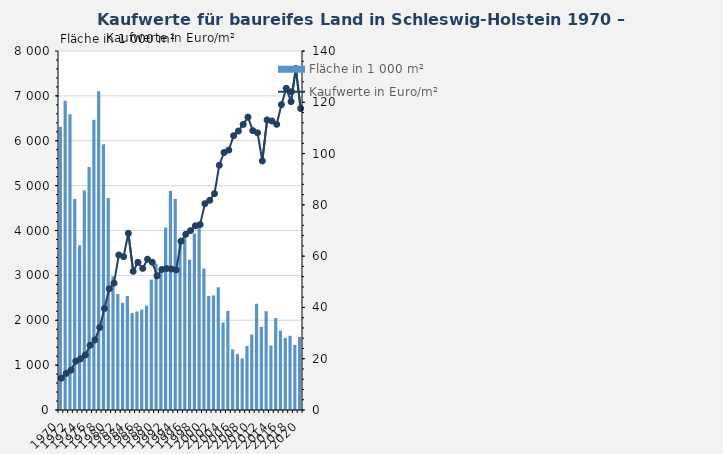
| Category | Fläche in 1 000 m² |
|---|---|
| 1970.0 | 6309.2 |
| 1971.0 | 6893 |
| 1972.0 | 6590.2 |
| 1973.0 | 4700.7 |
| 1974.0 | 3669.7 |
| 1975.0 | 4891.8 |
| 1976.0 | 5414.2 |
| 1977.0 | 6470.1 |
| 1978.0 | 7103.7 |
| 1979.0 | 5922.7 |
| 1980.0 | 4720.9 |
| 1981.0 | 2976.6 |
| 1982.0 | 2585.4 |
| 1983.0 | 2388.2 |
| 1984.0 | 2540.7 |
| 1985.0 | 2160.4 |
| 1986.0 | 2196.1 |
| 1987.0 | 2238.6 |
| 1988.0 | 2323.8 |
| 1989.0 | 2904.5 |
| 1990.0 | 3261.7 |
| 1991.0 | 3185.5 |
| 1992.0 | 4067 |
| 1993.0 | 4877.9 |
| 1994.0 | 4705.8 |
| 1995.0 | 3750.7 |
| 1996.0 | 3941.1 |
| 1997.0 | 3350.9 |
| 1998.0 | 3933 |
| 1999.0 | 4143.4 |
| 2000.0 | 3152.1 |
| 2001.0 | 2538.5 |
| 2002.0 | 2552 |
| 2003.0 | 2734.8 |
| 2004.0 | 1949.3 |
| 2005.0 | 2207.4 |
| 2006.0 | 1352.3 |
| 2007.0 | 1243.8 |
| 2008.0 | 1149.5 |
| 2009.0 | 1426 |
| 2010.0 | 1681 |
| 2011.0 | 2368 |
| 2012.0 | 1852 |
| 2013.0 | 2202 |
| 2014.0 | 1436 |
| 2015.0 | 2049 |
| 2016.0 | 1766 |
| 2017.0 | 1608 |
| 2018.0 | 1653 |
| 2019.0 | 1451 |
| 2020.0 | 1630 |